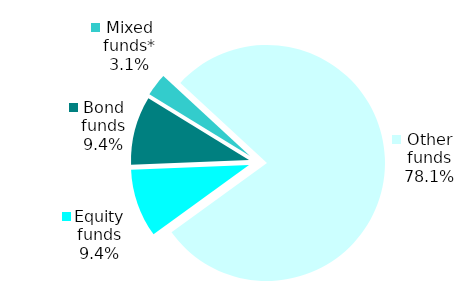
| Category | Series 0 |
|---|---|
| Equity funds | 3 |
| Bond funds | 3 |
| Mixed funds* | 1 |
| Other funds | 25 |